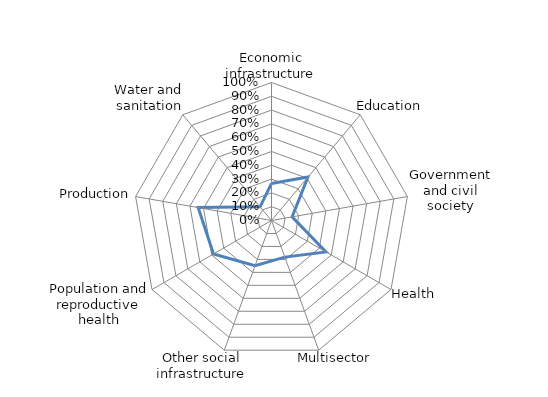
| Category | Series 0 |
|---|---|
| Economic infrastructure | 0.268 |
| Education | 0.411 |
| Government and civil society | 0.151 |
| Health | 0.456 |
| Multisector | 0.282 |
| Other social infrastructure | 0.349 |
| Population and reproductive health | 0.485 |
| Production | 0.54 |
| Water and sanitation | 0.129 |